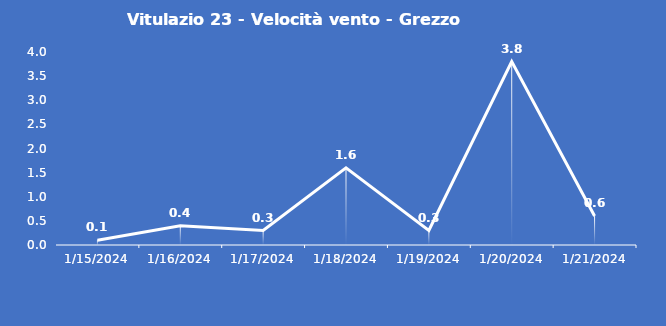
| Category | Vitulazio 23 - Velocità vento - Grezzo (m/s) |
|---|---|
| 1/15/24 | 0.1 |
| 1/16/24 | 0.4 |
| 1/17/24 | 0.3 |
| 1/18/24 | 1.6 |
| 1/19/24 | 0.3 |
| 1/20/24 | 3.8 |
| 1/21/24 | 0.6 |